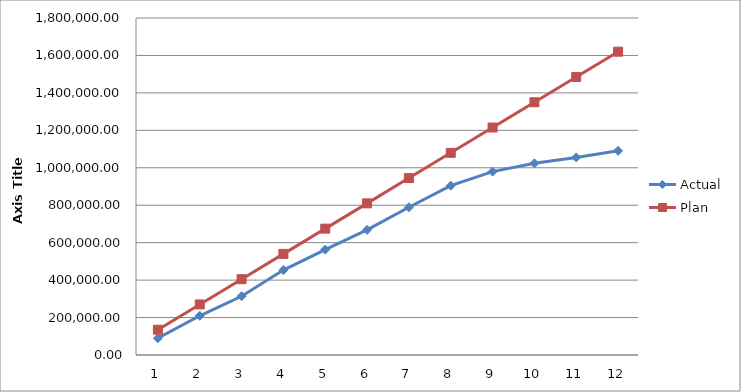
| Category | Actual | Plan |
|---|---|---|
| 0 | 89791.57 | 135000 |
| 1 | 209419.83 | 270000 |
| 2 | 313879.29 | 405000 |
| 3 | 453685.04 | 540000 |
| 4 | 563078.29 | 675000 |
| 5 | 668517.55 | 810000 |
| 6 | 789184.54 | 945000 |
| 7 | 904369.97 | 1080000 |
| 8 | 979613.64 | 1215000 |
| 9 | 1023698.96 | 1350000 |
| 10 | 1055306.03 | 1485000 |
| 11 | 1090478.01 | 1620000 |